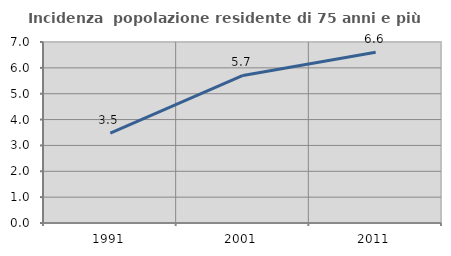
| Category | Incidenza  popolazione residente di 75 anni e più |
|---|---|
| 1991.0 | 3.475 |
| 2001.0 | 5.706 |
| 2011.0 | 6.601 |